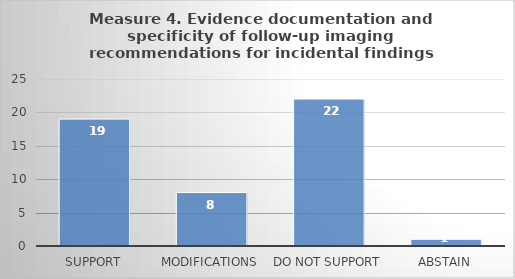
| Category | Series 0 |
|---|---|
| Support | 19 |
| Modifications | 8 |
| Do not support | 22 |
| Abstain | 1 |